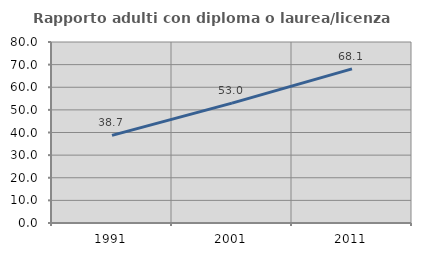
| Category | Rapporto adulti con diploma o laurea/licenza media  |
|---|---|
| 1991.0 | 38.735 |
| 2001.0 | 52.981 |
| 2011.0 | 68.138 |